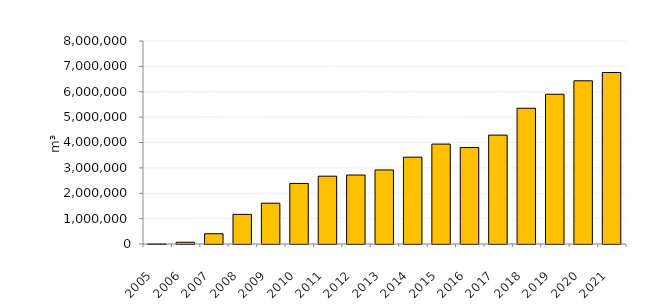
| Category | Series 0 |
|---|---|
| 2005.0 | 736.16 |
| 2006.0 | 69001.981 |
| 2007.0 | 404329.14 |
| 2008.0 | 1167128.415 |
| 2009.0 | 1608448.417 |
| 2010.0 | 2386398.518 |
| 2011.0 | 2672759.918 |
| 2012.0 | 2717483.489 |
| 2013.0 | 2917488.269 |
| 2014.0 | 3422209.897 |
| 2015.0 | 3937268.534 |
| 2016.0 | 3801338.998 |
| 2017.0 | 4291293.772 |
| 2018.0 | 5350036.398 |
| 2019.0 | 5901104.354 |
| 2020.0 | 6432036.594 |
| 2021.0 | 6758382.372 |